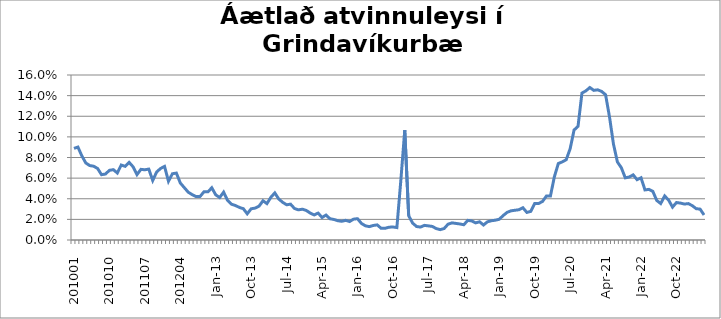
| Category | Series 0 |
|---|---|
| 201001 | 0.089 |
| 201002 | 0.09 |
| 201003 | 0.082 |
| 201004 | 0.075 |
| 201005 | 0.072 |
| 201006 | 0.072 |
| 201007 | 0.069 |
| 201008 | 0.063 |
| 201009 | 0.064 |
| 201010 | 0.068 |
| 201011 | 0.068 |
| 201012 | 0.065 |
| 201101 | 0.073 |
| 201102 | 0.071 |
| 201103 | 0.075 |
| 201104 | 0.071 |
| 201105 | 0.063 |
| 201106 | 0.069 |
| 201107 | 0.068 |
| 201108 | 0.069 |
| 201109 | 0.058 |
| 201110 | 0.066 |
| 201111 | 0.069 |
| 201112 | 0.071 |
| 201201 | 0.057 |
| 201202 | 0.064 |
| 201203 | 0.065 |
| 201204 | 0.055 |
| 201205 | 0.051 |
| 201206 | 0.046 |
| 201207 | 0.044 |
| 201208 | 0.042 |
| 201209 | 0.042 |
| 201210 | 0.047 |
| 201211 | 0.047 |
| 201212 | 0.051 |
| Jan-13 | 0.044 |
| Feb-13 | 0.041 |
| Mar-13 | 0.046 |
| Apr-13 | 0.038 |
| May-13 | 0.035 |
| Jun-13 | 0.033 |
| Jul-13 | 0.032 |
| Aug-13 | 0.03 |
| Sep-13 | 0.025 |
| Oct-13 | 0.03 |
| Nov-13 | 0.031 |
| Dec-13 | 0.033 |
| Jan-14 | 0.038 |
| Feb-14 | 0.035 |
| Mar-14 | 0.041 |
| Apr-14 | 0.046 |
| May-14 | 0.04 |
| Jun-14 | 0.037 |
| Jul-14 | 0.034 |
| Aug-14 | 0.035 |
| Sep-14 | 0.031 |
| Oct-14 | 0.029 |
| Nov-14 | 0.03 |
| Dec-14 | 0.029 |
| Jan-15 | 0.026 |
| Feb-15 | 0.024 |
| Mar-15 | 0.026 |
| Apr-15 | 0.022 |
| May-15 | 0.024 |
| Jun-15 | 0.021 |
| Jul-15 | 0.02 |
| Aug-15 | 0.019 |
| Sep-15 | 0.018 |
| Oct-15 | 0.019 |
| Nov-15 | 0.018 |
| Dec-15 | 0.02 |
| Jan-16 | 0.021 |
| Feb-16 | 0.016 |
| Mar-16 | 0.014 |
| Apr-16 | 0.013 |
| May-16 | 0.014 |
| Jun-16 | 0.015 |
| Jul-16 | 0.011 |
| Aug-16 | 0.011 |
| Sep-16 | 0.012 |
| Oct-16 | 0.013 |
| Nov-16 | 0.012 |
| Dec-16 | 0.058 |
| Jan-17 | 0.106 |
| Feb-17 | 0.023 |
| Mar-17 | 0.016 |
| Apr-17 | 0.013 |
| May-17 | 0.013 |
| Jun-17 | 0.014 |
| Jul-17 | 0.014 |
| Aug-17 | 0.013 |
| Sep-17 | 0.011 |
| Oct-17 | 0.01 |
| Nov-17 | 0.011 |
| Dec-17 | 0.015 |
| Jan-18 | 0.017 |
| Feb-18 | 0.016 |
| Mar-18 | 0.016 |
| Apr-18 | 0.015 |
| May-18 | 0.019 |
| Jun-18 | 0.018 |
| Jul-18 | 0.017 |
| Aug-18 | 0.018 |
| Sep-18 | 0.015 |
| Oct-18 | 0.018 |
| Nov-18 | 0.019 |
| Dec-18 | 0.019 |
| Jan-19 | 0.02 |
| Feb-19 | 0.024 |
| Mar-19 | 0.027 |
| Apr-19 | 0.028 |
| May-19 | 0.029 |
| Jun-19 | 0.029 |
| Jul-19 | 0.031 |
| Aug-19 | 0.027 |
| Sep-19 | 0.028 |
| Oct-19 | 0.035 |
| Nov-19 | 0.035 |
| Dec-19 | 0.037 |
| Jan-20 | 0.043 |
| Feb-20 | 0.043 |
| mars 2020 *** | 0.061 |
| Apr-20 | 0.074 |
| May-20 | 0.076 |
| Jun-20 | 0.078 |
| Jul-20 | 0.088 |
| Aug-20 | 0.107 |
| Sep-20 | 0.11 |
| Oct-20 | 0.142 |
| Nov-20 | 0.145 |
| Dec-20 | 0.148 |
| Jan-21 | 0.145 |
| Feb-21 | 0.146 |
| Mar-21 | 0.144 |
| Apr-21 | 0.141 |
| May-21 | 0.119 |
| Jun-21 | 0.093 |
| Jul-21 | 0.076 |
| Aug-21 | 0.07 |
| Sep-21 | 0.06 |
| Oct-21 | 0.061 |
| Nov-21 | 0.063 |
| Dec-21 | 0.058 |
| Jan-22 | 0.06 |
| Feb-22 | 0.049 |
| Mar-22 | 0.049 |
| Apr-22 | 0.047 |
| May-22 | 0.038 |
| Jun-22 | 0.035 |
| Jul-22 | 0.043 |
| Aug-22 | 0.039 |
| Sep-22 | 0.032 |
| Oct-22 | 0.036 |
| Nov-22 | 0.036 |
| Dec-22 | 0.035 |
| Jan-23 | 0.035 |
| Feb-23 | 0.033 |
| Mar-23 | 0.03 |
| Apr-23 | 0.03 |
| May-23 | 0.024 |